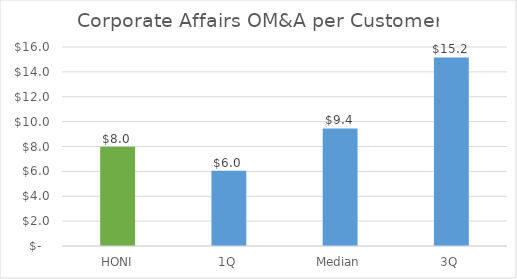
| Category | Corporate Affairs OM&A per Customer |
|---|---|
| HONI | 7.984 |
| 1Q | 6.045 |
| Median | 9.45 |
| 3Q | 15.158 |